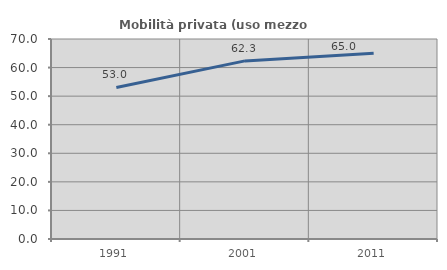
| Category | Mobilità privata (uso mezzo privato) |
|---|---|
| 1991.0 | 53.031 |
| 2001.0 | 62.338 |
| 2011.0 | 65.035 |